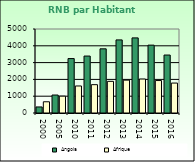
| Category | Angola | Afrique                        |
|---|---|---|
| 2000.0 | 360 | 668.557 |
| 2005.0 | 1070 | 1002.896 |
| 2010.0 | 3240 | 1608.999 |
| 2011.0 | 3390 | 1686.521 |
| 2012.0 | 3820 | 1885.129 |
| 2013.0 | 4350 | 1956.671 |
| 2014.0 | 4470 | 2022.289 |
| 2015.0 | 4040 | 1932.283 |
| 2016.0 | 3450 | 1781.415 |